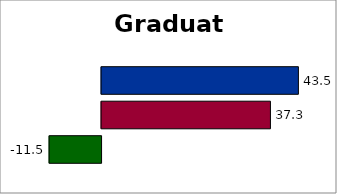
| Category | Series 2 | SREB states | 50 states and D.C. |
|---|---|---|---|
| 0 | -11.475 | 37.288 | 43.464 |